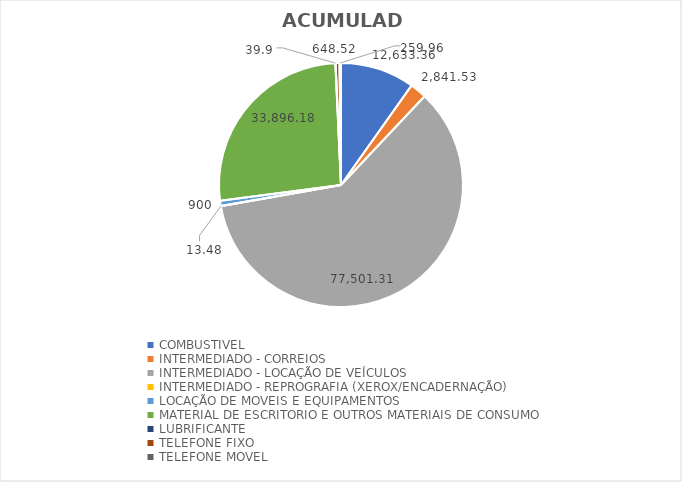
| Category | ACUMULADO |
|---|---|
| COMBUSTIVEL | 12633.36 |
| INTERMEDIADO - CORREIOS | 2841.53 |
| INTERMEDIADO - LOCAÇÃO DE VEÍCULOS | 77501.31 |
| INTERMEDIADO - REPROGRAFIA (XEROX/ENCADERNAÇÃO) | 13.48 |
| LOCAÇÃO DE MOVEIS E EQUIPAMENTOS | 900 |
| MATERIAL DE ESCRITORIO E OUTROS MATERIAIS DE CONSUMO | 33896.18 |
| LUBRIFICANTE | 39.9 |
| TELEFONE FIXO | 648.52 |
| TELEFONE MOVEL | 259.96 |